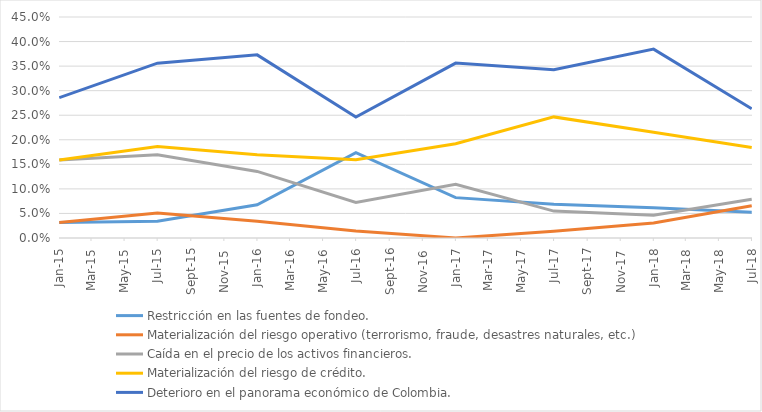
| Category | Restricción en las fuentes de fondeo. | Materialización del riesgo operativo (terrorismo, fraude, desastres naturales, etc.) | Caída en el precio de los activos financieros. | Materialización del riesgo de crédito. | Deterioro en el panorama económico de Colombia. |
|---|---|---|---|---|---|
| 2015-01-01 | 0.032 | 0.032 | 0.159 | 0.159 | 0.286 |
| 2015-07-01 | 0.034 | 0.051 | 0.169 | 0.186 | 0.356 |
| 2016-01-01 | 0.068 | 0.034 | 0.136 | 0.169 | 0.373 |
| 2016-07-01 | 0.174 | 0.014 | 0.072 | 0.159 | 0.246 |
| 2017-01-01 | 0.082 | 0 | 0.11 | 0.192 | 0.356 |
| 2017-07-01 | 0.068 | 0.014 | 0.055 | 0.247 | 0.342 |
| 2018-01-01 | 0.062 | 0.031 | 0.046 | 0.215 | 0.385 |
| 2018-07-01 | 0.053 | 0.066 | 0.079 | 0.184 | 0.263 |